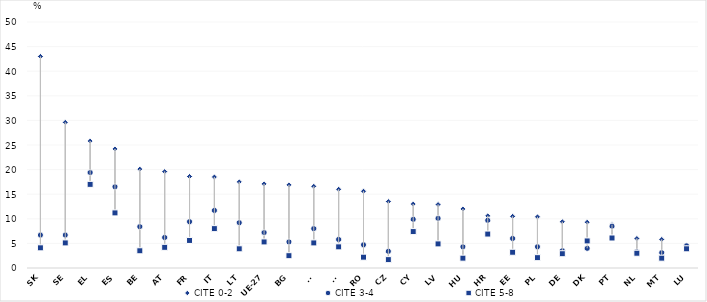
| Category | CITE 0-2 | CITE 3-4 | CITE 5-8 |
|---|---|---|---|
| SK | 43 | 6.7 | 4.1 |
| SE | 29.6 | 6.7 | 5.1 |
| EL | 25.8 | 19.4 | 17 |
| ES | 24.2 | 16.5 | 11.2 |
| BE | 20.1 | 8.4 | 3.5 |
| AT | 19.6 | 6.2 | 4.2 |
| FR | 18.6 | 9.4 | 5.6 |
| IT | 18.5 | 11.7 | 8 |
| LT | 17.5 | 9.2 | 3.9 |
| UE-27 | 17.1 | 7.2 | 5.3 |
| BG | 16.9 | 5.3 | 2.5 |
| FI | 16.6 | 8 | 5.1 |
| SI | 16 | 5.8 | 4.3 |
| RO | 15.6 | 4.7 | 2.2 |
| CZ | 13.5 | 3.4 | 1.7 |
| CY | 13 | 9.9 | 7.4 |
| LV | 12.9 | 10.1 | 4.9 |
| HU | 12 | 4.3 | 2 |
| HR | 10.6 | 9.7 | 6.9 |
| EE | 10.5 | 6 | 3.2 |
| PL | 10.4 | 4.3 | 2.1 |
| DE | 9.4 | 3.5 | 2.9 |
| DK | 9.3 | 4 | 5.5 |
| PT | 8.8 | 8.5 | 6.1 |
| NL | 6 | 3.3 | 3 |
| MT | 5.8 | 3.1 | 2 |
| LU | 4.6 | 4.5 | 3.9 |